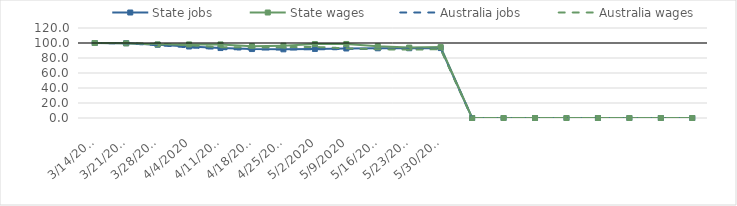
| Category | State jobs | State wages | Australia jobs | Australia wages |
|---|---|---|---|---|
| 14/03/2020 | 100 | 100 | 100 | 100 |
| 21/03/2020 | 99.694 | 99.557 | 99.552 | 99.902 |
| 28/03/2020 | 97.682 | 98.113 | 97.088 | 98.771 |
| 04/04/2020 | 95.35 | 98.109 | 94.15 | 97.007 |
| 11/04/2020 | 93.265 | 98.096 | 91.933 | 94.434 |
| 18/04/2020 | 91.919 | 95.672 | 91.108 | 94.115 |
| 25/04/2020 | 91.555 | 96.475 | 91.306 | 94.452 |
| 02/05/2020 | 92.088 | 98.53 | 91.63 | 94.778 |
| 09/05/2020 | 92.682 | 98.707 | 91.91 | 92.892 |
| 16/05/2020 | 92.947 | 95.66 | 92.165 | 91.712 |
| 23/05/2020 | 93.02 | 93.872 | 92.167 | 91.106 |
| 30/05/2020 | 93.248 | 94.528 | 92.546 | 91.708 |